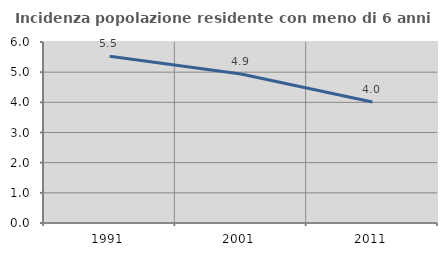
| Category | Incidenza popolazione residente con meno di 6 anni |
|---|---|
| 1991.0 | 5.527 |
| 2001.0 | 4.94 |
| 2011.0 | 4.014 |